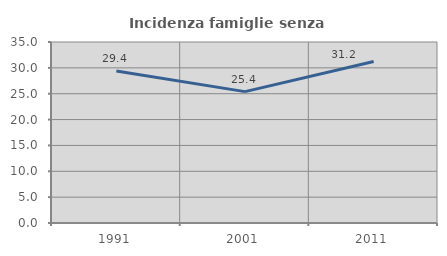
| Category | Incidenza famiglie senza nuclei |
|---|---|
| 1991.0 | 29.396 |
| 2001.0 | 25.407 |
| 2011.0 | 31.22 |